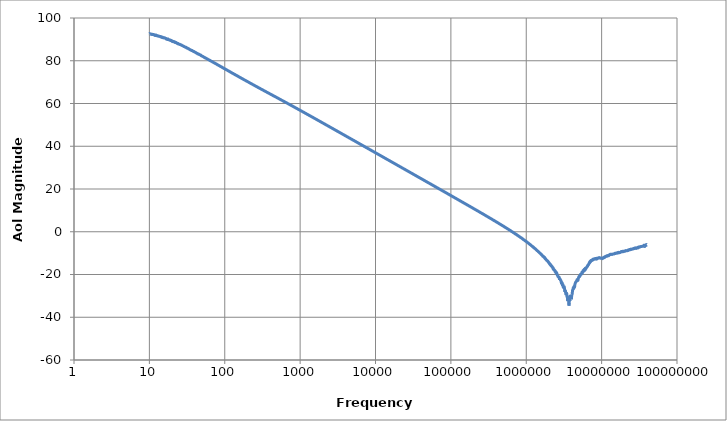
| Category | Series 0 |
|---|---|
| 10.0 | 92.591 |
| 10.09546407 | 92.7 |
| 10.19183948 | 92.512 |
| 10.28913493 | 92.458 |
| 10.3873592 | 92.511 |
| 10.48652116 | 92.381 |
| 10.58662976 | 92.43 |
| 10.68769404 | 92.298 |
| 10.78972311 | 92.463 |
| 10.8927262 | 92.353 |
| 10.9967126 | 92.318 |
| 11.1016917 | 92.265 |
| 11.20767296 | 92.247 |
| 11.31466597 | 92.255 |
| 11.42268038 | 92.222 |
| 11.53172594 | 92.225 |
| 11.64181249 | 91.982 |
| 11.75294997 | 92.092 |
| 11.86514841 | 91.826 |
| 11.97841795 | 91.79 |
| 12.0927688 | 91.899 |
| 12.2082113 | 92.087 |
| 12.32475585 | 91.768 |
| 12.44241299 | 91.79 |
| 12.56119333 | 91.826 |
| 12.68110759 | 91.707 |
| 12.80216661 | 91.664 |
| 12.9243813 | 91.721 |
| 13.04776271 | 91.502 |
| 13.17232196 | 91.509 |
| 13.29807031 | 91.483 |
| 13.4250191 | 91.486 |
| 13.5531798 | 91.474 |
| 13.68256397 | 91.367 |
| 13.8131833 | 91.392 |
| 13.94504957 | 91.362 |
| 14.07817469 | 91.272 |
| 14.21257067 | 91.076 |
| 14.34824966 | 91.198 |
| 14.48522389 | 91.152 |
| 14.62350574 | 91.155 |
| 14.76310767 | 90.836 |
| 14.90404231 | 91.067 |
| 15.04632236 | 90.822 |
| 15.18996068 | 90.888 |
| 15.33497023 | 90.731 |
| 15.4813641 | 90.709 |
| 15.6291555 | 90.747 |
| 15.77835778 | 90.623 |
| 15.92898441 | 90.768 |
| 16.08104898 | 90.647 |
| 16.23456522 | 90.533 |
| 16.38954699 | 90.501 |
| 16.54600828 | 90.346 |
| 16.70396321 | 90.421 |
| 16.86342604 | 90.084 |
| 17.02441117 | 90.178 |
| 17.18693313 | 90.158 |
| 17.35100659 | 89.984 |
| 17.51664636 | 90.024 |
| 17.6838674 | 90.174 |
| 17.85268479 | 89.893 |
| 18.02311379 | 89.968 |
| 18.19516977 | 89.839 |
| 18.36886827 | 89.802 |
| 18.54422496 | 89.749 |
| 18.72125568 | 89.538 |
| 18.89997641 | 89.731 |
| 19.08040328 | 89.518 |
| 19.26255258 | 89.433 |
| 19.44644075 | 89.397 |
| 19.63208438 | 89.474 |
| 19.81950025 | 89.29 |
| 20.00870527 | 89.025 |
| 20.19971652 | 89.212 |
| 20.39255123 | 89.081 |
| 20.58722683 | 89.015 |
| 20.78376088 | 88.862 |
| 20.98217112 | 88.993 |
| 21.18247547 | 89.021 |
| 21.384692 | 88.896 |
| 21.58883897 | 88.831 |
| 21.79493482 | 88.574 |
| 22.00299814 | 88.716 |
| 22.21304772 | 88.505 |
| 22.42510251 | 88.502 |
| 22.63918167 | 88.549 |
| 22.85530451 | 88.339 |
| 23.07349056 | 88.304 |
| 23.29375949 | 88.112 |
| 23.5161312 | 88.097 |
| 23.74062576 | 88.026 |
| 23.96726344 | 88.112 |
| 24.19606469 | 87.83 |
| 24.42705018 | 87.874 |
| 24.66024074 | 87.782 |
| 24.89565744 | 87.741 |
| 25.13332152 | 87.732 |
| 25.37325444 | 87.586 |
| 25.61547785 | 87.619 |
| 25.86001363 | 87.513 |
| 26.10688385 | 87.434 |
| 26.35611079 | 87.348 |
| 26.60771695 | 87.287 |
| 26.86172505 | 87.326 |
| 27.11815801 | 87.136 |
| 27.37703899 | 87.077 |
| 27.63839135 | 86.973 |
| 27.90223868 | 86.903 |
| 28.16860481 | 86.88 |
| 28.43751378 | 86.81 |
| 28.70898986 | 86.744 |
| 28.98305756 | 86.598 |
| 29.25974163 | 86.545 |
| 29.53906703 | 86.457 |
| 29.82105899 | 86.463 |
| 30.10574296 | 86.294 |
| 30.39314464 | 86.317 |
| 30.68328997 | 86.297 |
| 30.97620515 | 86.208 |
| 31.27191661 | 86.022 |
| 31.57045106 | 85.884 |
| 31.87183543 | 85.893 |
| 32.17609695 | 85.831 |
| 32.48326307 | 85.768 |
| 32.79336152 | 85.687 |
| 33.1064203 | 85.546 |
| 33.42246767 | 85.541 |
| 33.74153215 | 85.402 |
| 34.06364255 | 85.352 |
| 34.38882795 | 85.208 |
| 34.7171177 | 85.161 |
| 35.04854144 | 85.07 |
| 35.38312908 | 85.077 |
| 35.72091083 | 84.962 |
| 36.06191719 | 84.86 |
| 36.40617893 | 84.752 |
| 36.75372714 | 84.833 |
| 37.10459318 | 84.684 |
| 37.45880873 | 84.602 |
| 37.81640576 | 84.494 |
| 38.17741657 | 84.421 |
| 38.54187373 | 84.417 |
| 38.90981014 | 84.288 |
| 39.28125903 | 84.249 |
| 39.65625392 | 84.098 |
| 40.03482866 | 84.046 |
| 40.41701744 | 83.956 |
| 40.80285474 | 83.898 |
| 41.1923754 | 83.839 |
| 41.58561458 | 83.728 |
| 41.98260779 | 83.671 |
| 42.38339085 | 83.529 |
| 42.78799995 | 83.458 |
| 43.19647162 | 83.391 |
| 43.60884272 | 83.215 |
| 44.02515049 | 83.28 |
| 44.4454325 | 83.131 |
| 44.86972669 | 83.119 |
| 45.29807136 | 82.998 |
| 45.73050519 | 83.036 |
| 46.16706721 | 82.89 |
| 46.60779683 | 82.829 |
| 47.05273383 | 82.763 |
| 47.50191838 | 82.666 |
| 47.95539103 | 82.668 |
| 48.41319272 | 82.487 |
| 48.87536476 | 82.348 |
| 49.34194889 | 82.262 |
| 49.81298722 | 82.225 |
| 50.28852227 | 82.144 |
| 50.76859698 | 82.053 |
| 51.25325467 | 82.018 |
| 51.74253911 | 81.913 |
| 52.23649445 | 81.824 |
| 52.73516529 | 81.7 |
| 53.23859664 | 81.589 |
| 53.74683396 | 81.596 |
| 54.25992311 | 81.496 |
| 54.77791043 | 81.434 |
| 55.30084266 | 81.284 |
| 55.82876702 | 81.229 |
| 56.36173115 | 81.197 |
| 56.89978318 | 81.085 |
| 57.44297167 | 81.032 |
| 57.99134567 | 80.938 |
| 58.54495466 | 80.855 |
| 59.10384863 | 80.807 |
| 59.66807803 | 80.711 |
| 60.23769379 | 80.55 |
| 60.81274734 | 80.468 |
| 61.39329058 | 80.46 |
| 61.97937592 | 80.324 |
| 62.57105627 | 80.313 |
| 63.16838505 | 80.191 |
| 63.77141617 | 80.128 |
| 64.38020407 | 80.012 |
| 64.9948037 | 79.978 |
| 65.61527056 | 79.846 |
| 66.24166064 | 79.814 |
| 66.8740305 | 79.73 |
| 67.51243722 | 79.662 |
| 68.15693842 | 79.533 |
| 68.8075923 | 79.465 |
| 69.46445759 | 79.411 |
| 70.12759358 | 79.259 |
| 70.79706014 | 79.253 |
| 71.47291769 | 79.116 |
| 72.15522726 | 79.022 |
| 72.84405043 | 78.97 |
| 73.53944939 | 78.921 |
| 74.24148691 | 78.82 |
| 74.95022637 | 78.726 |
| 75.66573174 | 78.643 |
| 76.38806761 | 78.593 |
| 77.1172992 | 78.487 |
| 77.85349234 | 78.433 |
| 78.59671347 | 78.296 |
| 79.34702969 | 78.234 |
| 80.10450873 | 78.124 |
| 80.86921898 | 78.061 |
| 81.64122947 | 77.99 |
| 82.42060988 | 77.888 |
| 83.20743057 | 77.828 |
| 84.00176258 | 77.747 |
| 84.8036776 | 77.668 |
| 85.61324802 | 77.574 |
| 86.43054694 | 77.445 |
| 87.25564813 | 77.361 |
| 88.08862606 | 77.31 |
| 88.92955595 | 77.221 |
| 89.77851369 | 77.186 |
| 90.63557593 | 77.096 |
| 91.50082003 | 77.011 |
| 92.37432411 | 76.903 |
| 93.25616701 | 76.828 |
| 94.14642834 | 76.724 |
| 95.04518847 | 76.677 |
| 95.95252853 | 76.551 |
| 96.86853043 | 76.488 |
| 97.79327685 | 76.426 |
| 98.72685128 | 76.341 |
| 99.669338 | 76.28 |
| 100.6208221 | 76.139 |
| 101.5813894 | 76.097 |
| 102.5511267 | 76.029 |
| 103.5301215 | 75.907 |
| 104.5184622 | 75.822 |
| 105.516238 | 75.769 |
| 106.5235389 | 75.683 |
| 107.540456 | 75.603 |
| 108.567081 | 75.524 |
| 109.6035065 | 75.415 |
| 110.6498262 | 75.36 |
| 111.7061345 | 75.261 |
| 112.7725267 | 75.181 |
| 113.8490992 | 75.079 |
| 114.935949 | 75.022 |
| 116.0331744 | 74.951 |
| 117.1408743 | 74.832 |
| 118.2591488 | 74.765 |
| 119.3880987 | 74.709 |
| 120.5278261 | 74.616 |
| 121.6784338 | 74.515 |
| 122.8400257 | 74.437 |
| 124.0127066 | 74.341 |
| 125.1965824 | 74.272 |
| 126.3917599 | 74.164 |
| 127.5983471 | 74.096 |
| 128.8164528 | 74.042 |
| 130.0461871 | 73.937 |
| 131.287661 | 73.834 |
| 132.5409864 | 73.775 |
| 133.8062767 | 73.711 |
| 135.0836458 | 73.62 |
| 136.3732093 | 73.513 |
| 137.6750835 | 73.471 |
| 138.9893859 | 73.356 |
| 140.3162351 | 73.289 |
| 141.655751 | 73.195 |
| 143.0080545 | 73.124 |
| 144.3732676 | 73.053 |
| 145.7515136 | 72.945 |
| 147.1429169 | 72.888 |
| 148.547603 | 72.828 |
| 149.9656989 | 72.711 |
| 151.3973325 | 72.634 |
| 152.8426331 | 72.57 |
| 154.3017311 | 72.468 |
| 155.7747582 | 72.377 |
| 157.2618475 | 72.332 |
| 158.7631331 | 72.225 |
| 160.2787506 | 72.139 |
| 161.8088368 | 72.067 |
| 163.3535298 | 71.974 |
| 164.9129691 | 71.922 |
| 166.4872955 | 71.819 |
| 168.076651 | 71.736 |
| 169.6811791 | 71.652 |
| 171.3010247 | 71.57 |
| 172.936334 | 71.492 |
| 174.5872547 | 71.422 |
| 176.2539357 | 71.33 |
| 177.9365275 | 71.236 |
| 179.635182 | 71.162 |
| 181.3500526 | 71.086 |
| 183.081294 | 71.013 |
| 184.8290626 | 70.907 |
| 186.593516 | 70.847 |
| 188.3748137 | 70.78 |
| 190.1731164 | 70.695 |
| 191.9885863 | 70.595 |
| 193.8213875 | 70.522 |
| 195.6716854 | 70.45 |
| 197.539647 | 70.352 |
| 199.4254409 | 70.287 |
| 201.3292373 | 70.215 |
| 203.2512082 | 70.125 |
| 205.1915269 | 70.052 |
| 207.1503688 | 69.969 |
| 209.1279105 | 69.886 |
| 211.1243307 | 69.793 |
| 213.1398095 | 69.706 |
| 215.1745289 | 69.626 |
| 217.2286725 | 69.555 |
| 219.3024259 | 69.459 |
| 221.3959761 | 69.402 |
| 223.5095122 | 69.31 |
| 225.643225 | 69.242 |
| 227.7973071 | 69.151 |
| 229.9719529 | 69.068 |
| 232.1673588 | 68.998 |
| 234.3837229 | 68.912 |
| 236.6212453 | 68.844 |
| 238.8801281 | 68.744 |
| 241.160575 | 68.673 |
| 243.462792 | 68.592 |
| 245.7869869 | 68.506 |
| 248.1333696 | 68.437 |
| 250.5021517 | 68.351 |
| 252.8935472 | 68.27 |
| 255.307772 | 68.202 |
| 257.7450439 | 68.111 |
| 260.205583 | 68.042 |
| 262.6896114 | 67.956 |
| 265.1973534 | 67.879 |
| 267.7290353 | 67.801 |
| 270.2848857 | 67.707 |
| 272.8651352 | 67.648 |
| 275.4700169 | 67.552 |
| 278.0997658 | 67.476 |
| 280.7546194 | 67.4 |
| 283.4348172 | 67.316 |
| 286.1406014 | 67.236 |
| 288.8722161 | 67.165 |
| 291.6299078 | 67.09 |
| 294.4139256 | 67.004 |
| 297.2245208 | 66.924 |
| 300.0619471 | 66.843 |
| 302.9264606 | 66.759 |
| 305.8183199 | 66.678 |
| 308.7377861 | 66.601 |
| 311.6851227 | 66.527 |
| 314.6605957 | 66.451 |
| 317.6644739 | 66.366 |
| 320.6970282 | 66.296 |
| 323.7585326 | 66.226 |
| 326.8492634 | 66.142 |
| 329.9694995 | 66.046 |
| 333.1195226 | 65.977 |
| 336.2996172 | 65.896 |
| 339.5100703 | 65.816 |
| 342.7511716 | 65.747 |
| 346.0232138 | 65.662 |
| 349.3264923 | 65.578 |
| 352.6613052 | 65.5 |
| 356.0279536 | 65.426 |
| 359.4267413 | 65.352 |
| 362.8579753 | 65.272 |
| 366.3219653 | 65.182 |
| 369.8190239 | 65.117 |
| 373.3494668 | 65.027 |
| 376.9136128 | 64.946 |
| 380.5117836 | 64.874 |
| 384.144304 | 64.797 |
| 387.8115019 | 64.721 |
| 391.5137083 | 64.636 |
| 395.2512576 | 64.565 |
| 399.024487 | 64.484 |
| 402.8337372 | 64.404 |
| 406.679352 | 64.33 |
| 410.5616786 | 64.246 |
| 414.4810676 | 64.162 |
| 418.4378726 | 64.088 |
| 422.4324508 | 64.016 |
| 426.465163 | 63.933 |
| 430.536373 | 63.863 |
| 434.6464485 | 63.77 |
| 438.7957604 | 63.693 |
| 442.9846834 | 63.619 |
| 447.2135955 | 63.533 |
| 451.4828785 | 63.455 |
| 455.7929179 | 63.379 |
| 460.1441026 | 63.298 |
| 464.5368255 | 63.23 |
| 468.9714832 | 63.149 |
| 473.4484759 | 63.074 |
| 477.9682077 | 62.994 |
| 482.5310868 | 62.916 |
| 487.137525 | 62.835 |
| 491.7879381 | 62.755 |
| 496.482746 | 62.672 |
| 501.2223724 | 62.598 |
| 506.0072452 | 62.526 |
| 510.8377963 | 62.445 |
| 515.7144619 | 62.37 |
| 520.6376821 | 62.284 |
| 525.6079013 | 62.206 |
| 530.6255683 | 62.117 |
| 535.691136 | 62.041 |
| 540.8050617 | 61.964 |
| 545.9678069 | 61.889 |
| 551.1798379 | 61.81 |
| 556.441625 | 61.738 |
| 561.7536432 | 61.65 |
| 567.1163722 | 61.572 |
| 572.5302959 | 61.496 |
| 577.9959032 | 61.415 |
| 583.5136874 | 61.341 |
| 589.0841466 | 61.258 |
| 594.7077837 | 61.175 |
| 600.3851062 | 61.097 |
| 606.1166269 | 61.014 |
| 611.9028629 | 60.936 |
| 617.7443368 | 60.86 |
| 623.6415757 | 60.787 |
| 629.595112 | 60.705 |
| 635.6054833 | 60.626 |
| 641.6732319 | 60.548 |
| 647.7989058 | 60.462 |
| 653.9830579 | 60.386 |
| 660.2262464 | 60.306 |
| 666.5290349 | 60.228 |
| 672.8919924 | 60.15 |
| 679.3156933 | 60.066 |
| 685.8007174 | 59.989 |
| 692.3476502 | 59.91 |
| 698.9570827 | 59.829 |
| 705.6296116 | 59.749 |
| 712.3658391 | 59.67 |
| 719.1663734 | 59.59 |
| 726.0318283 | 59.508 |
| 732.9628237 | 59.425 |
| 739.9599852 | 59.35 |
| 747.0239445 | 59.266 |
| 754.1553391 | 59.191 |
| 761.354813 | 59.113 |
| 768.623016 | 59.036 |
| 775.9606042 | 58.95 |
| 783.36824 | 58.869 |
| 790.8465921 | 58.781 |
| 798.3963356 | 58.718 |
| 806.018152 | 58.628 |
| 813.7127294 | 58.547 |
| 821.4807624 | 58.47 |
| 829.3229521 | 58.392 |
| 837.2400066 | 58.314 |
| 845.2326406 | 58.233 |
| 853.3015754 | 58.147 |
| 861.4475396 | 58.07 |
| 869.6712685 | 57.986 |
| 877.9735045 | 57.91 |
| 886.354997 | 57.83 |
| 894.8165026 | 57.744 |
| 903.3587852 | 57.668 |
| 911.9826159 | 57.588 |
| 920.6887732 | 57.509 |
| 929.478043 | 57.428 |
| 938.3512188 | 57.343 |
| 947.3091015 | 57.271 |
| 956.3524998 | 57.185 |
| 965.4822301 | 57.102 |
| 974.6991165 | 57.026 |
| 984.003991 | 56.941 |
| 993.3976937 | 56.866 |
| 1002.881072 | 56.784 |
| 1012.454983 | 56.711 |
| 1022.120291 | 56.624 |
| 1031.877867 | 56.541 |
| 1041.728593 | 56.459 |
| 1051.673359 | 56.38 |
| 1061.713061 | 56.303 |
| 1071.848606 | 56.218 |
| 1082.080909 | 56.14 |
| 1092.410894 | 56.063 |
| 1102.839493 | 55.98 |
| 1113.367647 | 55.901 |
| 1123.996308 | 55.819 |
| 1134.726435 | 55.736 |
| 1145.558995 | 55.655 |
| 1156.494968 | 55.576 |
| 1167.535339 | 55.488 |
| 1178.681107 | 55.411 |
| 1189.933277 | 55.326 |
| 1201.292864 | 55.245 |
| 1212.760895 | 55.164 |
| 1224.338404 | 55.081 |
| 1236.026437 | 55.002 |
| 1247.826048 | 54.922 |
| 1259.738304 | 54.839 |
| 1271.764278 | 54.763 |
| 1283.905058 | 54.677 |
| 1296.161738 | 54.594 |
| 1308.535426 | 54.515 |
| 1321.027238 | 54.433 |
| 1333.638301 | 54.355 |
| 1346.369756 | 54.275 |
| 1359.222749 | 54.192 |
| 1372.198443 | 54.111 |
| 1385.298008 | 54.024 |
| 1398.522627 | 53.952 |
| 1411.873493 | 53.868 |
| 1425.351812 | 53.785 |
| 1438.958801 | 53.708 |
| 1452.695687 | 53.624 |
| 1466.563711 | 53.544 |
| 1480.564126 | 53.46 |
| 1494.698194 | 53.381 |
| 1508.967191 | 53.296 |
| 1523.372406 | 53.218 |
| 1537.915139 | 53.132 |
| 1552.596703 | 53.052 |
| 1567.418423 | 52.968 |
| 1582.381638 | 52.889 |
| 1597.487697 | 52.812 |
| 1612.737965 | 52.72 |
| 1628.133818 | 52.646 |
| 1643.676646 | 52.562 |
| 1659.367852 | 52.479 |
| 1675.208853 | 52.404 |
| 1691.201079 | 52.318 |
| 1707.345973 | 52.237 |
| 1723.644993 | 52.156 |
| 1740.099609 | 52.072 |
| 1756.711309 | 51.991 |
| 1773.48159 | 51.913 |
| 1790.411967 | 51.827 |
| 1807.503969 | 51.75 |
| 1824.759137 | 51.666 |
| 1842.179031 | 51.582 |
| 1859.765222 | 51.503 |
| 1877.519298 | 51.419 |
| 1895.442861 | 51.339 |
| 1913.53753 | 51.255 |
| 1931.804939 | 51.178 |
| 1950.246735 | 51.088 |
| 1968.864584 | 51.013 |
| 1987.660167 | 50.928 |
| 2006.63518 | 50.844 |
| 2025.791336 | 50.762 |
| 2045.130365 | 50.679 |
| 2064.654012 | 50.602 |
| 2084.36404 | 50.519 |
| 2104.262227 | 50.438 |
| 2124.350371 | 50.359 |
| 2144.630285 | 50.276 |
| 2165.103798 | 50.189 |
| 2185.772761 | 50.112 |
| 2206.639037 | 50.03 |
| 2227.704512 | 49.946 |
| 2248.971086 | 49.861 |
| 2270.440679 | 49.784 |
| 2292.11523 | 49.7 |
| 2313.996695 | 49.617 |
| 2336.08705 | 49.537 |
| 2358.388288 | 49.457 |
| 2380.902422 | 49.373 |
| 2403.631486 | 49.289 |
| 2426.577531 | 49.211 |
| 2449.742628 | 49.126 |
| 2473.128868 | 49.042 |
| 2496.738363 | 48.962 |
| 2520.573244 | 48.876 |
| 2544.635662 | 48.798 |
| 2568.92779 | 48.716 |
| 2593.45182 | 48.635 |
| 2618.209967 | 48.55 |
| 2643.204465 | 48.47 |
| 2668.437571 | 48.391 |
| 2693.911562 | 48.306 |
| 2719.628739 | 48.227 |
| 2745.591422 | 48.138 |
| 2771.801955 | 48.058 |
| 2798.262705 | 47.981 |
| 2824.97606 | 47.9 |
| 2851.944431 | 47.814 |
| 2879.170254 | 47.733 |
| 2906.655985 | 47.65 |
| 2934.404107 | 47.567 |
| 2962.417123 | 47.488 |
| 2990.697562 | 47.4 |
| 3019.247979 | 47.322 |
| 3048.070949 | 47.239 |
| 3077.169075 | 47.159 |
| 3106.544984 | 47.068 |
| 3136.201327 | 46.988 |
| 3166.140781 | 46.914 |
| 3196.36605 | 46.83 |
| 3226.879862 | 46.744 |
| 3257.68497 | 46.661 |
| 3288.784157 | 46.58 |
| 3320.18023 | 46.496 |
| 3351.876022 | 46.417 |
| 3383.874395 | 46.337 |
| 3416.178237 | 46.254 |
| 3448.790465 | 46.164 |
| 3481.714023 | 46.088 |
| 3514.951882 | 46.008 |
| 3548.507044 | 45.924 |
| 3582.382537 | 45.842 |
| 3616.581419 | 45.759 |
| 3651.106777 | 45.675 |
| 3685.961729 | 45.597 |
| 3721.14942 | 45.515 |
| 3756.673027 | 45.433 |
| 3792.535757 | 45.347 |
| 3828.740847 | 45.265 |
| 3865.291566 | 45.186 |
| 3902.191213 | 45.101 |
| 3939.443118 | 45.02 |
| 3977.050646 | 44.935 |
| 4015.017191 | 44.859 |
| 4053.346179 | 44.772 |
| 4092.041072 | 44.687 |
| 4131.105362 | 44.606 |
| 4170.542575 | 44.523 |
| 4210.356272 | 44.443 |
| 4250.550047 | 44.362 |
| 4291.127528 | 44.277 |
| 4332.092378 | 44.197 |
| 4373.448296 | 44.116 |
| 4415.199014 | 44.038 |
| 4457.348301 | 43.953 |
| 4499.899962 | 43.866 |
| 4542.857839 | 43.783 |
| 4586.225809 | 43.704 |
| 4630.007788 | 43.62 |
| 4674.207727 | 43.538 |
| 4718.829616 | 43.459 |
| 4763.877485 | 43.374 |
| 4809.355399 | 43.292 |
| 4855.267463 | 43.208 |
| 4901.617823 | 43.126 |
| 4948.410662 | 43.041 |
| 4995.650204 | 42.967 |
| 5043.340715 | 42.873 |
| 5091.486498 | 42.792 |
| 5140.091901 | 42.716 |
| 5189.161311 | 42.637 |
| 5238.699157 | 42.554 |
| 5288.709912 | 42.464 |
| 5339.19809 | 42.385 |
| 5390.168248 | 42.304 |
| 5441.624988 | 42.219 |
| 5493.572956 | 42.14 |
| 5546.016839 | 42.057 |
| 5598.961374 | 41.969 |
| 5652.411338 | 41.896 |
| 5706.371558 | 41.804 |
| 5760.846904 | 41.731 |
| 5815.842293 | 41.641 |
| 5871.362691 | 41.559 |
| 5927.41311 | 41.481 |
| 5983.998608 | 41.399 |
| 6041.124295 | 41.315 |
| 6098.795327 | 41.231 |
| 6157.01691 | 41.152 |
| 6215.794299 | 41.068 |
| 6275.132802 | 40.977 |
| 6335.037774 | 40.903 |
| 6395.514624 | 40.82 |
| 6456.56881 | 40.738 |
| 6518.205844 | 40.661 |
| 6580.43129 | 40.572 |
| 6643.250766 | 40.494 |
| 6706.669942 | 40.412 |
| 6770.694544 | 40.327 |
| 6835.33035 | 40.246 |
| 6900.583196 | 40.162 |
| 6966.458972 | 40.08 |
| 7032.963626 | 39.994 |
| 7100.103159 | 39.914 |
| 7167.883635 | 39.83 |
| 7236.31117 | 39.753 |
| 7305.391942 | 39.663 |
| 7375.132187 | 39.582 |
| 7445.538201 | 39.504 |
| 7516.61634 | 39.416 |
| 7588.373019 | 39.339 |
| 7660.814717 | 39.257 |
| 7733.947973 | 39.172 |
| 7807.779389 | 39.092 |
| 7882.315629 | 39.013 |
| 7957.563423 | 38.928 |
| 8033.529563 | 38.848 |
| 8110.220906 | 38.767 |
| 8187.644376 | 38.68 |
| 8265.806963 | 38.602 |
| 8344.715721 | 38.516 |
| 8424.377774 | 38.435 |
| 8504.800314 | 38.354 |
| 8585.990599 | 38.267 |
| 8667.955961 | 38.188 |
| 8750.703797 | 38.101 |
| 8834.241578 | 38.027 |
| 8918.576844 | 37.933 |
| 9003.717209 | 37.855 |
| 9089.670359 | 37.769 |
| 9176.444052 | 37.695 |
| 9264.046123 | 37.611 |
| 9352.484478 | 37.527 |
| 9441.767102 | 37.444 |
| 9531.902055 | 37.364 |
| 9622.897472 | 37.284 |
| 9714.761568 | 37.199 |
| 9807.502637 | 37.116 |
| 9901.12905 | 37.03 |
| 9995.649258 | 36.954 |
| 10091.07179 | 36.866 |
| 10187.40527 | 36.787 |
| 10284.65839 | 36.708 |
| 10382.83993 | 36.623 |
| 10481.95874 | 36.541 |
| 10582.02379 | 36.46 |
| 10683.0441 | 36.374 |
| 10785.02878 | 36.294 |
| 10887.98706 | 36.208 |
| 10991.92822 | 36.131 |
| 11096.86164 | 36.044 |
| 11202.7968 | 35.966 |
| 11309.74325 | 35.876 |
| 11417.71067 | 35.8 |
| 11526.70878 | 35.717 |
| 11636.74744 | 35.631 |
| 11747.83656 | 35.556 |
| 11859.98619 | 35.467 |
| 11973.20645 | 35.387 |
| 12087.50755 | 35.304 |
| 12202.89982 | 35.219 |
| 12319.39367 | 35.139 |
| 12436.99962 | 35.062 |
| 12555.72828 | 34.972 |
| 12675.59037 | 34.892 |
| 12796.59672 | 34.81 |
| 12918.75824 | 34.733 |
| 13042.08596 | 34.643 |
| 13166.59102 | 34.558 |
| 13292.28466 | 34.48 |
| 13419.17822 | 34.393 |
| 13547.28316 | 34.313 |
| 13676.61104 | 34.233 |
| 13807.17354 | 34.148 |
| 13938.98244 | 34.07 |
| 14072.04964 | 33.978 |
| 14206.38715 | 33.901 |
| 14342.00711 | 33.817 |
| 14478.92174 | 33.738 |
| 14617.14343 | 33.654 |
| 14756.68463 | 33.57 |
| 14897.55795 | 33.495 |
| 15039.7761 | 33.407 |
| 15183.35192 | 33.323 |
| 15328.29838 | 33.243 |
| 15474.62856 | 33.163 |
| 15622.35566 | 33.075 |
| 15771.49303 | 32.994 |
| 15922.05412 | 32.912 |
| 16074.05253 | 32.826 |
| 16227.50198 | 32.746 |
| 16382.41632 | 32.665 |
| 16538.80953 | 32.586 |
| 16696.69574 | 32.498 |
| 16856.0892 | 32.416 |
| 17017.00429 | 32.33 |
| 17179.45554 | 32.249 |
| 17343.45761 | 32.171 |
| 17509.02532 | 32.087 |
| 17676.1736 | 32.008 |
| 17844.91755 | 31.921 |
| 18015.2724 | 31.842 |
| 18187.25352 | 31.765 |
| 18360.87645 | 31.675 |
| 18536.15685 | 31.598 |
| 18713.11055 | 31.512 |
| 18891.75352 | 31.428 |
| 19072.10189 | 31.345 |
| 19254.17194 | 31.259 |
| 19437.9801 | 31.177 |
| 19623.54297 | 31.096 |
| 19810.8773 | 31.022 |
| 20000.0 | 30.935 |
| 20190.92814 | 30.855 |
| 20383.67896 | 30.774 |
| 20578.26986 | 30.692 |
| 20774.7184 | 30.601 |
| 20973.04232 | 30.523 |
| 21173.25952 | 30.438 |
| 21375.38807 | 30.355 |
| 21579.44623 | 30.276 |
| 21785.45241 | 30.19 |
| 21993.4252 | 30.105 |
| 22203.38339 | 30.028 |
| 22415.34593 | 29.945 |
| 22629.33195 | 29.855 |
| 22845.36076 | 29.775 |
| 23063.45188 | 29.694 |
| 23283.62498 | 29.615 |
| 23505.89994 | 29.529 |
| 23730.29683 | 29.446 |
| 23956.8359 | 29.368 |
| 24185.53761 | 29.29 |
| 24416.4226 | 29.202 |
| 24649.51171 | 29.12 |
| 24884.82598 | 29.039 |
| 25122.38666 | 28.949 |
| 25362.21519 | 28.871 |
| 25604.33322 | 28.791 |
| 25848.76261 | 28.709 |
| 26095.52542 | 28.625 |
| 26344.64392 | 28.543 |
| 26596.14062 | 28.462 |
| 26850.03821 | 28.378 |
| 27106.3596 | 28.302 |
| 27365.12794 | 28.213 |
| 27626.36659 | 28.132 |
| 27890.09914 | 28.051 |
| 28156.34938 | 27.968 |
| 28425.14135 | 27.882 |
| 28696.49932 | 27.801 |
| 28970.44778 | 27.713 |
| 29247.01147 | 27.632 |
| 29526.21535 | 27.554 |
| 29808.08462 | 27.463 |
| 30092.64473 | 27.388 |
| 30379.92137 | 27.308 |
| 30669.94046 | 27.216 |
| 30962.7282 | 27.14 |
| 31258.31101 | 27.053 |
| 31556.71557 | 26.972 |
| 31857.96882 | 26.891 |
| 32162.09796 | 26.807 |
| 32469.13044 | 26.72 |
| 32779.09398 | 26.639 |
| 33092.01655 | 26.558 |
| 33407.92641 | 26.48 |
| 33726.85208 | 26.396 |
| 34048.82234 | 26.317 |
| 34373.86626 | 26.23 |
| 34702.01318 | 26.145 |
| 35033.29272 | 26.069 |
| 35367.73479 | 25.981 |
| 35705.36959 | 25.896 |
| 36046.22758 | 25.812 |
| 36390.33954 | 25.74 |
| 36737.73654 | 25.651 |
| 37088.44993 | 25.568 |
| 37442.51137 | 25.493 |
| 37799.95282 | 25.402 |
| 38160.80656 | 25.317 |
| 38525.10515 | 25.24 |
| 38892.88149 | 25.154 |
| 39264.16877 | 25.074 |
| 39639.00051 | 24.989 |
| 40017.41054 | 24.903 |
| 40399.43303 | 24.831 |
| 40785.10247 | 24.75 |
| 41174.45366 | 24.663 |
| 41567.52175 | 24.575 |
| 41964.34224 | 24.491 |
| 42364.95093 | 24.419 |
| 42769.384 | 24.331 |
| 43177.67795 | 24.246 |
| 43589.86964 | 24.166 |
| 44005.99628 | 24.08 |
| 44426.09543 | 23.996 |
| 44850.20503 | 23.916 |
| 45278.36334 | 23.833 |
| 45710.60903 | 23.753 |
| 46146.98111 | 23.669 |
| 46587.51898 | 23.59 |
| 47032.2624 | 23.507 |
| 47481.25152 | 23.422 |
| 47934.52688 | 23.339 |
| 48392.12938 | 23.253 |
| 48854.10035 | 23.168 |
| 49320.48148 | 23.088 |
| 49791.31487 | 23.01 |
| 50266.64303 | 22.933 |
| 50746.50887 | 22.844 |
| 51230.9557 | 22.756 |
| 51720.02726 | 22.681 |
| 52213.7677 | 22.597 |
| 52712.22158 | 22.515 |
| 53215.4339 | 22.424 |
| 53723.4501 | 22.341 |
| 54236.31602 | 22.263 |
| 54754.07797 | 22.185 |
| 55276.78269 | 22.103 |
| 55804.47736 | 22.014 |
| 56337.20962 | 21.936 |
| 56875.02755 | 21.853 |
| 57417.97972 | 21.765 |
| 57966.11513 | 21.687 |
| 58519.48326 | 21.604 |
| 59078.13407 | 21.521 |
| 59642.11799 | 21.431 |
| 60211.48592 | 21.35 |
| 60786.28928 | 21.271 |
| 61366.57994 | 21.188 |
| 61952.41029 | 21.11 |
| 62543.83322 | 21.026 |
| 63140.90211 | 20.942 |
| 63743.67087 | 20.854 |
| 64352.1939 | 20.776 |
| 64966.52614 | 20.693 |
| 65586.72304 | 20.612 |
| 66212.8406 | 20.525 |
| 66844.93533 | 20.445 |
| 67483.0643 | 20.364 |
| 68127.2851 | 20.276 |
| 68777.6559 | 20.192 |
| 69434.2354 | 20.113 |
| 70097.08287 | 20.033 |
| 70766.25816 | 19.942 |
| 71441.82167 | 19.863 |
| 72123.83438 | 19.783 |
| 72812.35786 | 19.701 |
| 73507.45427 | 19.617 |
| 74209.18635 | 19.533 |
| 74917.61746 | 19.451 |
| 75632.81153 | 19.37 |
| 76354.83314 | 19.287 |
| 77083.74746 | 19.208 |
| 77819.62029 | 19.12 |
| 78562.51806 | 19.044 |
| 79312.50784 | 18.955 |
| 80069.65733 | 18.871 |
| 80834.03487 | 18.8 |
| 81605.70947 | 18.707 |
| 82384.7508 | 18.627 |
| 83171.22917 | 18.545 |
| 83965.21558 | 18.465 |
| 84766.7817 | 18.377 |
| 85575.99991 | 18.292 |
| 86392.94324 | 18.223 |
| 87217.68545 | 18.129 |
| 88050.30098 | 18.036 |
| 88890.86499 | 17.962 |
| 89739.45337 | 17.876 |
| 90596.14273 | 17.799 |
| 91461.01039 | 17.72 |
| 92334.13442 | 17.633 |
| 93215.59366 | 17.556 |
| 94105.46766 | 17.463 |
| 95003.83676 | 17.381 |
| 95910.78206 | 17.301 |
| 96826.38543 | 17.208 |
| 97750.72952 | 17.135 |
| 98683.89778 | 17.051 |
| 99625.97444 | 16.965 |
| 100577.0445 | 16.881 |
| 101537.194 | 16.794 |
| 102506.5093 | 16.718 |
| 103485.0782 | 16.636 |
| 104472.9889 | 16.555 |
| 105470.3306 | 16.47 |
| 106477.1933 | 16.384 |
| 107493.6679 | 16.303 |
| 108519.8462 | 16.223 |
| 109555.8209 | 16.137 |
| 110601.6853 | 16.054 |
| 111657.534 | 15.97 |
| 112723.4623 | 15.887 |
| 113799.5664 | 15.809 |
| 114885.9433 | 15.719 |
| 115982.6913 | 15.648 |
| 117089.9093 | 15.559 |
| 118207.6973 | 15.475 |
| 119336.1561 | 15.397 |
| 120475.3876 | 15.306 |
| 121625.4947 | 15.224 |
| 122786.5812 | 15.143 |
| 123958.7518 | 15.058 |
| 125142.1125 | 14.969 |
| 126336.7701 | 14.899 |
| 127542.8323 | 14.808 |
| 128760.4081 | 14.735 |
| 129989.6074 | 14.638 |
| 131230.5411 | 14.556 |
| 132483.3213 | 14.477 |
| 133748.061 | 14.394 |
| 135024.8744 | 14.315 |
| 136313.8768 | 14.228 |
| 137615.1846 | 14.138 |
| 138928.9152 | 14.066 |
| 140255.1872 | 13.974 |
| 141594.1203 | 13.894 |
| 142945.8354 | 13.808 |
| 144310.4545 | 13.728 |
| 145688.1009 | 13.645 |
| 147078.8988 | 13.556 |
| 148482.9738 | 13.481 |
| 149900.4527 | 13.399 |
| 151331.4635 | 13.313 |
| 152776.1352 | 13.236 |
| 154234.5984 | 13.147 |
| 155706.9847 | 13.063 |
| 157193.4269 | 12.977 |
| 158694.0594 | 12.904 |
| 160209.0175 | 12.811 |
| 161738.438 | 12.73 |
| 163282.4589 | 12.646 |
| 164841.2198 | 12.562 |
| 166414.8611 | 12.48 |
| 168003.5252 | 12.399 |
| 169607.3552 | 12.311 |
| 171226.496 | 12.223 |
| 172861.0939 | 12.145 |
| 174511.2963 | 12.058 |
| 176177.2521 | 11.975 |
| 177859.1119 | 11.887 |
| 179557.0274 | 11.814 |
| 181271.1519 | 11.726 |
| 183001.6401 | 11.643 |
| 184748.6482 | 11.552 |
| 186512.334 | 11.471 |
| 188292.8567 | 11.39 |
| 190090.3769 | 11.314 |
| 191905.0571 | 11.229 |
| 193737.0609 | 11.14 |
| 195586.5537 | 11.056 |
| 197453.7026 | 10.968 |
| 199338.676 | 10.887 |
| 201241.6441 | 10.802 |
| 203162.7788 | 10.712 |
| 205102.2534 | 10.638 |
| 207060.243 | 10.548 |
| 209036.9244 | 10.46 |
| 211032.4759 | 10.386 |
| 213047.0779 | 10.294 |
| 215080.912 | 10.21 |
| 217134.1619 | 10.128 |
| 219207.013 | 10.048 |
| 221299.6524 | 9.953 |
| 223412.269 | 9.882 |
| 225545.0534 | 9.797 |
| 227698.1983 | 9.719 |
| 229871.898 | 9.632 |
| 232066.3487 | 9.553 |
| 234281.7486 | 9.462 |
| 236518.2975 | 9.382 |
| 238776.1975 | 9.289 |
| 241055.6523 | 9.207 |
| 243356.8676 | 9.118 |
| 245680.0514 | 9.03 |
| 248025.4131 | 8.952 |
| 250393.1647 | 8.866 |
| 252783.5198 | 8.775 |
| 255196.6942 | 8.701 |
| 257632.9057 | 8.618 |
| 260092.3743 | 8.524 |
| 262575.322 | 8.45 |
| 265081.9729 | 8.368 |
| 267612.5533 | 8.279 |
| 270167.2917 | 8.194 |
| 272746.4186 | 8.109 |
| 275350.167 | 8.014 |
| 277978.7718 | 7.935 |
| 280632.4703 | 7.849 |
| 283311.5021 | 7.758 |
| 286016.109 | 7.684 |
| 288746.5352 | 7.594 |
| 291503.0272 | 7.5 |
| 294285.8337 | 7.422 |
| 297095.2061 | 7.337 |
| 299931.3979 | 7.253 |
| 302794.6651 | 7.158 |
| 305685.2662 | 7.09 |
| 308603.4622 | 7 |
| 311549.5165 | 6.9 |
| 314523.695 | 6.821 |
| 317526.2662 | 6.742 |
| 320557.5012 | 6.649 |
| 323617.6736 | 6.557 |
| 326707.0597 | 6.479 |
| 329825.9383 | 6.385 |
| 332974.5909 | 6.314 |
| 336153.3019 | 6.214 |
| 339362.3582 | 6.135 |
| 342602.0494 | 6.056 |
| 345872.668 | 5.968 |
| 349174.5093 | 5.878 |
| 352507.8713 | 5.792 |
| 355873.055 | 5.706 |
| 359270.364 | 5.609 |
| 362700.1052 | 5.525 |
| 366162.588 | 5.433 |
| 369658.1251 | 5.359 |
| 373187.0321 | 5.27 |
| 376749.6274 | 5.173 |
| 380346.2327 | 5.101 |
| 383977.1727 | 5.019 |
| 387642.7751 | 4.922 |
| 391343.3708 | 4.83 |
| 395079.2939 | 4.745 |
| 398850.8817 | 4.665 |
| 402658.4746 | 4.569 |
| 406502.4163 | 4.482 |
| 410383.0539 | 4.4 |
| 414300.7375 | 4.297 |
| 418255.821 | 4.228 |
| 422248.6614 | 4.139 |
| 426279.619 | 4.05 |
| 430349.0577 | 3.957 |
| 434457.345 | 3.865 |
| 438604.8517 | 3.785 |
| 442791.9522 | 3.683 |
| 447019.0244 | 3.598 |
| 451286.45 | 3.513 |
| 455594.6141 | 3.431 |
| 459943.9058 | 3.362 |
| 464334.7175 | 3.258 |
| 468767.4458 | 3.158 |
| 473242.4906 | 3.058 |
| 477760.2561 | 2.978 |
| 482321.15 | 2.882 |
| 486925.584 | 2.807 |
| 491573.9739 | 2.71 |
| 496266.7391 | 2.637 |
| 501004.3035 | 2.541 |
| 505787.0945 | 2.456 |
| 510615.544 | 2.334 |
| 515490.0878 | 2.254 |
| 520411.1661 | 2.145 |
| 525379.2229 | 2.081 |
| 530394.7068 | 1.983 |
| 535458.0706 | 1.899 |
| 540569.7713 | 1.829 |
| 545730.2704 | 1.731 |
| 550940.0337 | 1.619 |
| 556199.5316 | 1.528 |
| 561509.2387 | 1.44 |
| 566869.6345 | 1.339 |
| 572281.2028 | 1.254 |
| 577744.4321 | 1.17 |
| 583259.8156 | 1.068 |
| 588827.8513 | 0.988 |
| 594449.0416 | 0.866 |
| 600123.8942 | 0.79 |
| 605852.9212 | 0.722 |
| 611636.6398 | 0.624 |
| 617475.5721 | 0.532 |
| 623370.2453 | 0.43 |
| 629321.1914 | 0.322 |
| 635328.9477 | 0.216 |
| 641394.0565 | 0.115 |
| 647517.0652 | 0.041 |
| 653698.5267 | -0.048 |
| 659938.999 | -0.146 |
| 666239.0453 | -0.239 |
| 672599.2344 | -0.353 |
| 679020.1405 | -0.444 |
| 685502.3432 | -0.531 |
| 692046.4276 | -0.618 |
| 698652.9845 | -0.719 |
| 705322.6103 | -0.84 |
| 712055.9071 | -0.927 |
| 718853.4827 | -1.057 |
| 725715.9506 | -1.128 |
| 732643.9305 | -1.207 |
| 739638.0477 | -1.267 |
| 746698.9336 | -1.394 |
| 753827.2256 | -1.501 |
| 761023.5672 | -1.64 |
| 768288.6079 | -1.706 |
| 775623.0037 | -1.794 |
| 783027.4167 | -1.884 |
| 790502.5151 | -2.015 |
| 798048.974 | -2.13 |
| 805667.4743 | -2.236 |
| 813358.704 | -2.313 |
| 821123.3573 | -2.415 |
| 828962.1351 | -2.499 |
| 836875.7451 | -2.608 |
| 844864.9017 | -2.754 |
| 852930.3259 | -2.8 |
| 861072.746 | -2.879 |
| 869292.897 | -3.003 |
| 877591.5209 | -3.153 |
| 885969.3668 | -3.233 |
| 894427.191 | -3.337 |
| 902965.7571 | -3.398 |
| 911585.8358 | -3.577 |
| 920288.2052 | -3.656 |
| 929073.6511 | -3.746 |
| 937942.9664 | -3.863 |
| 946896.9517 | -3.959 |
| 955936.4155 | -4.093 |
| 965062.1737 | -4.23 |
| 974275.05 | -4.279 |
| 983575.8763 | -4.391 |
| 992965.492 | -4.48 |
| 1002444.745 | -4.621 |
| 1012014.49 | -4.745 |
| 1021675.593 | -4.824 |
| 1031428.924 | -4.922 |
| 1041275.364 | -5.055 |
| 1051215.803 | -5.167 |
| 1061251.137 | -5.267 |
| 1071382.272 | -5.372 |
| 1081610.123 | -5.539 |
| 1091935.614 | -5.652 |
| 1102359.676 | -5.712 |
| 1112883.25 | -5.86 |
| 1123507.286 | -6.021 |
| 1134232.744 | -6.09 |
| 1145060.592 | -6.179 |
| 1155991.806 | -6.331 |
| 1167027.375 | -6.457 |
| 1178168.293 | -6.568 |
| 1189415.567 | -6.685 |
| 1200770.212 | -6.848 |
| 1212233.254 | -6.932 |
| 1223805.726 | -6.971 |
| 1235488.674 | -7.118 |
| 1247283.151 | -7.353 |
| 1259190.224 | -7.383 |
| 1271210.967 | -7.53 |
| 1283346.464 | -7.74 |
| 1295597.812 | -7.824 |
| 1307966.116 | -7.837 |
| 1320452.493 | -8.048 |
| 1333058.07 | -8.182 |
| 1345783.985 | -8.248 |
| 1358631.387 | -8.402 |
| 1371601.435 | -8.533 |
| 1384695.3 | -8.675 |
| 1397914.165 | -8.832 |
| 1411259.223 | -8.959 |
| 1424731.678 | -9.04 |
| 1438332.747 | -9.182 |
| 1452063.657 | -9.419 |
| 1465925.647 | -9.453 |
| 1479919.97 | -9.61 |
| 1494047.889 | -9.819 |
| 1508310.678 | -9.855 |
| 1522709.626 | -10.09 |
| 1537246.032 | -10.17 |
| 1551921.208 | -10.279 |
| 1566736.48 | -10.458 |
| 1581693.184 | -10.67 |
| 1596792.671 | -10.692 |
| 1612036.304 | -10.936 |
| 1627425.459 | -11.067 |
| 1642961.525 | -11.21 |
| 1658645.904 | -11.481 |
| 1674480.013 | -11.411 |
| 1690465.281 | -11.563 |
| 1706603.151 | -11.753 |
| 1722895.079 | -11.97 |
| 1739342.537 | -12.1 |
| 1755947.009 | -12.05 |
| 1772709.994 | -12.516 |
| 1789633.005 | -12.577 |
| 1806717.57 | -12.668 |
| 1823965.232 | -12.976 |
| 1841377.546 | -13.047 |
| 1858956.086 | -13.331 |
| 1876702.438 | -13.314 |
| 1894618.203 | -13.533 |
| 1912705.0 | -13.613 |
| 1930964.46 | -13.761 |
| 1949398.233 | -14.135 |
| 1968007.982 | -14.086 |
| 1986795.387 | -14.47 |
| 2005762.145 | -14.477 |
| 2024909.967 | -14.919 |
| 2044240.582 | -14.937 |
| 2063755.734 | -15.296 |
| 2083457.187 | -15.173 |
| 2103346.717 | -15.645 |
| 2123426.121 | -15.592 |
| 2143697.211 | -16.034 |
| 2164161.818 | -15.973 |
| 2184821.787 | -16.176 |
| 2205678.985 | -16.305 |
| 2226735.295 | -16.679 |
| 2247992.617 | -16.693 |
| 2269452.869 | -17.31 |
| 2291117.99 | -17.136 |
| 2312989.935 | -17.75 |
| 2335070.679 | -17.773 |
| 2357362.214 | -17.899 |
| 2379866.553 | -17.974 |
| 2402585.728 | -18.541 |
| 2425521.789 | -18.377 |
| 2448676.808 | -18.896 |
| 2472052.873 | -19.232 |
| 2495652.097 | -18.888 |
| 2519476.607 | -19.591 |
| 2543528.557 | -19.355 |
| 2567810.116 | -20.142 |
| 2592323.476 | -20.317 |
| 2617070.852 | -20.679 |
| 2642054.475 | -21.007 |
| 2667276.603 | -20.945 |
| 2692739.511 | -21.113 |
| 2718445.499 | -21.489 |
| 2744396.886 | -21.373 |
| 2770596.016 | -22.533 |
| 2797045.253 | -21.986 |
| 2823746.986 | -22.275 |
| 2850703.624 | -22.697 |
| 2877917.601 | -22.845 |
| 2905391.374 | -23.225 |
| 2933127.423 | -24.134 |
| 2961128.251 | -23.914 |
| 2989396.387 | -23.867 |
| 3017934.382 | -24.978 |
| 3046744.812 | -24.932 |
| 3075830.278 | -24.818 |
| 3105193.406 | -26.045 |
| 3134836.847 | -25.743 |
| 3164763.275 | -25.718 |
| 3194975.394 | -25.818 |
| 3225475.929 | -26.835 |
| 3256267.636 | -28.117 |
| 3287353.292 | -27.266 |
| 3318735.705 | -28.026 |
| 3350417.707 | -29.166 |
| 3382402.158 | -28.778 |
| 3414691.946 | -28.807 |
| 3447289.985 | -28.932 |
| 3480199.219 | -30.663 |
| 3513422.617 | -30.31 |
| 3546963.18 | -32.456 |
| 3580823.934 | -30.408 |
| 3615007.937 | -31.53 |
| 3649518.275 | -31.117 |
| 3684358.062 | -34.597 |
| 3719530.444 | -33.232 |
| 3755038.595 | -31.012 |
| 3790885.722 | -30.194 |
| 3827075.061 | -30.326 |
| 3863609.877 | -31.619 |
| 3900493.47 | -31.359 |
| 3937729.168 | -31.235 |
| 3975320.334 | -31.645 |
| 4013270.36 | -29.509 |
| 4051582.673 | -29.533 |
| 4090260.73 | -28.288 |
| 4129308.024 | -27.168 |
| 4168728.08 | -27.039 |
| 4208524.455 | -26.166 |
| 4248700.742 | -26.622 |
| 4289260.569 | -25.671 |
| 4330207.597 | -25.822 |
| 4371545.521 | -25.947 |
| 4413278.074 | -24.84 |
| 4455409.023 | -24.204 |
| 4497942.172 | -23.88 |
| 4540881.359 | -23.478 |
| 4584230.461 | -23.38 |
| 4627993.391 | -23.195 |
| 4672174.1 | -22.965 |
| 4716776.575 | -22.449 |
| 4761804.845 | -22.517 |
| 4807262.972 | -22.636 |
| 4853155.061 | -22.722 |
| 4899485.255 | -21.859 |
| 4946257.736 | -21.475 |
| 4993476.726 | -21.06 |
| 5041146.487 | -20.812 |
| 5089271.324 | -21.086 |
| 5137855.58 | -20.793 |
| 5186903.641 | -20.585 |
| 5236419.934 | -19.981 |
| 5286408.931 | -19.932 |
| 5336875.142 | -19.672 |
| 5387823.125 | -19.821 |
| 5439257.478 | -19.701 |
| 5491182.844 | -18.909 |
| 5543603.911 | -18.896 |
| 5596525.41 | -19.096 |
| 5649952.12 | -18.917 |
| 5703888.863 | -18.081 |
| 5758340.508 | -18.419 |
| 5813311.97 | -18.285 |
| 5868808.213 | -17.576 |
| 5924834.245 | -18.123 |
| 5981395.125 | -17.953 |
| 6038495.958 | -17.15 |
| 6096141.898 | -17.692 |
| 6154338.15 | -16.919 |
| 6213089.968 | -17.151 |
| 6272402.654 | -16.717 |
| 6332281.563 | -16.652 |
| 6392732.1 | -16.538 |
| 6453759.723 | -16.095 |
| 6515369.941 | -16.078 |
| 6577568.315 | -15.593 |
| 6640360.459 | -15.489 |
| 6703752.043 | -15.402 |
| 6767748.789 | -15.081 |
| 6832356.474 | -14.71 |
| 6897580.93 | -14.316 |
| 6963428.046 | -14.485 |
| 7029903.765 | -13.83 |
| 7097014.088 | -13.911 |
| 7164765.073 | -13.948 |
| 7233162.837 | -13.426 |
| 7302213.554 | -13.543 |
| 7371923.457 | -13.508 |
| 7442298.84 | -13.187 |
| 7513346.054 | -13.229 |
| 7585071.514 | -13.291 |
| 7657481.694 | -12.951 |
| 7730583.132 | -12.824 |
| 7804382.425 | -12.757 |
| 7878886.237 | -12.973 |
| 7954101.292 | -12.82 |
| 8030034.381 | -12.781 |
| 8106692.358 | -12.761 |
| 8184082.144 | -12.532 |
| 8262210.723 | -12.832 |
| 8341085.15 | -12.507 |
| 8420712.544 | -12.542 |
| 8501100.094 | -12.671 |
| 8582255.056 | -12.802 |
| 8664184.757 | -12.443 |
| 8746896.592 | -12.353 |
| 8830398.027 | -12.47 |
| 8914696.601 | -12.428 |
| 8999799.924 | -12.374 |
| 9085715.678 | -12.186 |
| 9172451.618 | -12.19 |
| 9260015.575 | -12.193 |
| 9348415.454 | -12.186 |
| 9437659.233 | -12.096 |
| 9527754.97 | -12.326 |
| 9618710.797 | -12.406 |
| 9710534.926 | -12.34 |
| 9803235.646 | -12.383 |
| 9896821.324 | -12.374 |
| 9991300.409 | -12.426 |
| 10086681.43 | -12.376 |
| 10182973.0 | -12.333 |
| 10280183.8 | -12.572 |
| 10378322.62 | -12.215 |
| 10477398.31 | -12.201 |
| 10577419.82 | -12.263 |
| 10678396.18 | -11.97 |
| 10780336.5 | -12.075 |
| 10883249.98 | -11.843 |
| 10987145.91 | -12.019 |
| 11092033.68 | -11.653 |
| 11197922.75 | -11.689 |
| 11304822.68 | -11.627 |
| 11412743.12 | -11.511 |
| 11521693.81 | -11.51 |
| 11631684.59 | -11.279 |
| 11742725.38 | -11.308 |
| 11854826.22 | -11.43 |
| 11967997.22 | -11.268 |
| 12082248.59 | -11.091 |
| 12197590.65 | -11.124 |
| 12314033.82 | -11.217 |
| 12431588.6 | -11.189 |
| 12550265.6 | -10.884 |
| 12670075.55 | -10.917 |
| 12791029.25 | -10.791 |
| 12913137.62 | -10.689 |
| 13036411.69 | -10.539 |
| 13160862.58 | -10.595 |
| 13286501.53 | -10.598 |
| 13413339.88 | -10.598 |
| 13541389.09 | -10.474 |
| 13670660.7 | -10.544 |
| 13801166.39 | -10.611 |
| 13932917.94 | -10.512 |
| 14065927.25 | -10.482 |
| 14200206.32 | -10.386 |
| 14335767.27 | -10.369 |
| 14472622.34 | -10.435 |
| 14610783.88 | -10.377 |
| 14750264.37 | -10.211 |
| 14891076.4 | -10.225 |
| 15033232.68 | -10.074 |
| 15176746.04 | -10.21 |
| 15321629.43 | -10.041 |
| 15467895.95 | -10.062 |
| 15615558.78 | -9.948 |
| 15764631.26 | -10.068 |
| 15915126.85 | -10.088 |
| 16067059.13 | -9.845 |
| 16220441.81 | -9.91 |
| 16375288.75 | -9.953 |
| 16531613.93 | -9.659 |
| 16689431.44 | -9.689 |
| 16848755.55 | -9.728 |
| 17009600.63 | -9.835 |
| 17171981.2 | -9.72 |
| 17335911.92 | -9.733 |
| 17501407.59 | -9.688 |
| 17668483.16 | -9.713 |
| 17837153.69 | -9.621 |
| 18007434.42 | -9.434 |
| 18179340.72 | -9.249 |
| 18352888.1 | -9.328 |
| 18528092.25 | -9.356 |
| 18704968.96 | -9.253 |
| 18883534.2 | -9.342 |
| 19063804.11 | -9.112 |
| 19245794.94 | -9.361 |
| 19429523.14 | -9.116 |
| 19615005.27 | -9.211 |
| 19802258.1 | -9.223 |
| 19991298.52 | -9.109 |
| 20182143.59 | -8.974 |
| 20374810.55 | -9.028 |
| 20569316.78 | -9.078 |
| 20765679.86 | -8.973 |
| 20963917.49 | -8.81 |
| 21164047.58 | -8.939 |
| 21366088.19 | -8.877 |
| 21570057.57 | -8.912 |
| 21775974.12 | -8.882 |
| 21983856.43 | -8.698 |
| 22193723.27 | -8.686 |
| 22405593.59 | -8.824 |
| 22619486.51 | -8.617 |
| 22835421.33 | -8.447 |
| 23053417.56 | -8.504 |
| 23273494.87 | -8.524 |
| 23495673.13 | -8.301 |
| 23719972.39 | -8.417 |
| 23946412.9 | -8.348 |
| 24175015.11 | -8.365 |
| 24405799.64 | -8.127 |
| 24638787.34 | -8.345 |
| 24873999.23 | -8.151 |
| 25111456.56 | -8.106 |
| 25351180.74 | -8.15 |
| 25593193.43 | -8.021 |
| 25837516.48 | -8.086 |
| 26084171.93 | -7.896 |
| 26333182.05 | -8.036 |
| 26584569.33 | -7.851 |
| 26838356.45 | -7.928 |
| 27094566.32 | -7.736 |
| 27353222.08 | -7.875 |
| 27614347.07 | -7.615 |
| 27877964.87 | -7.656 |
| 28144099.27 | -7.569 |
| 28412774.3 | -7.544 |
| 28684014.21 | -7.813 |
| 28957843.49 | -7.585 |
| 29234286.85 | -7.48 |
| 29513369.25 | -7.508 |
| 29795115.89 | -7.391 |
| 30079552.2 | -7.582 |
| 30366703.85 | -7.279 |
| 30656596.76 | -7.523 |
| 30949257.12 | -7.139 |
| 31244711.32 | -7.272 |
| 31542986.06 | -7.199 |
| 31844108.24 | -7.051 |
| 32148105.06 | -7.041 |
| 32455003.96 | -7.122 |
| 32764832.64 | -6.981 |
| 33077619.07 | -6.937 |
| 33393391.49 | -6.853 |
| 33712178.39 | -6.954 |
| 34034008.57 | -6.881 |
| 34358911.07 | -6.827 |
| 34686915.23 | -6.765 |
| 35018050.64 | -6.824 |
| 35352347.2 | -6.703 |
| 35689835.1 | -6.674 |
| 36030544.8 | -6.77 |
| 36374507.04 | -6.307 |
| 36721752.9 | -6.402 |
| 37072313.7 | -6.514 |
| 37426221.1 | -6.857 |
| 37783507.04 | -6.27 |
| 38144203.78 | -6.364 |
| 38508343.87 | -6.202 |
| 38875960.2 | -6.355 |
| 39247085.94 | -5.951 |
| 39621754.6 | -6.279 |
| 40000000.0 | -6.236 |